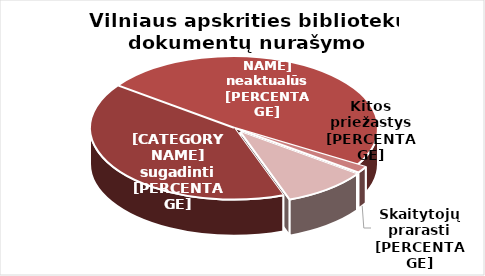
| Category | Series 0 |
|---|---|
| Susidėvėję, | 77417 |
| Nepaklausūs, | 92372 |
| Skaitytojų  | 2830 |
| Kt. | 18036 |